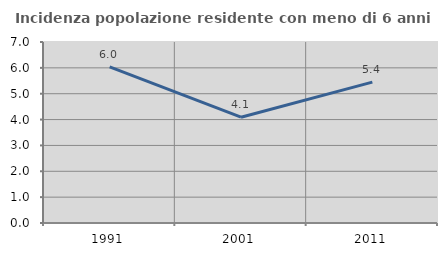
| Category | Incidenza popolazione residente con meno di 6 anni |
|---|---|
| 1991.0 | 6.034 |
| 2001.0 | 4.091 |
| 2011.0 | 5.449 |